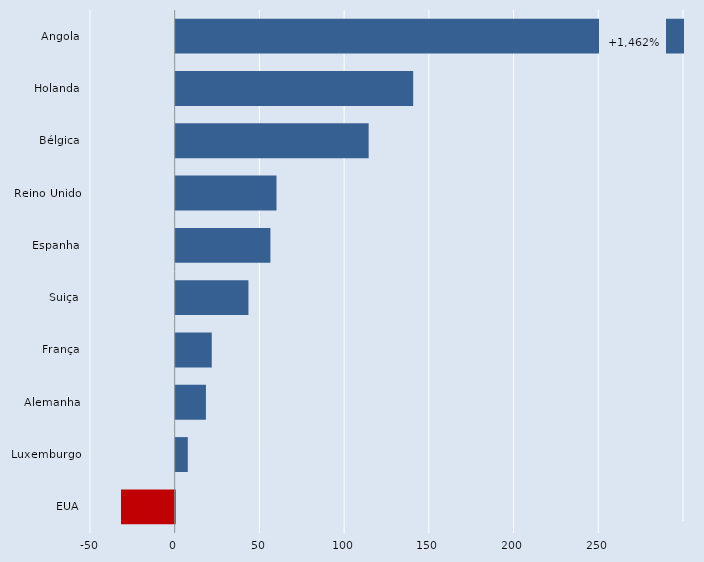
| Category | Series 0 |
|---|---|
| Angola | 300 |
| Holanda | 140.162 |
| Bélgica | 113.874 |
| Reino Unido | 59.486 |
| Espanha | 55.895 |
| Suiça | 42.928 |
| França | 21.275 |
| Alemanha | 17.837 |
| Luxemburgo | 7.132 |
| EUA | -31.709 |